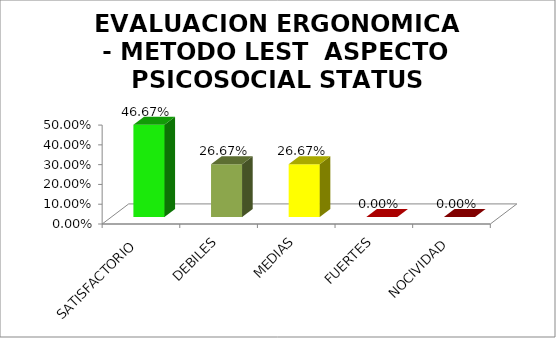
| Category | EVALUACION ERGONOMICA - METODO LEST  |
|---|---|
| SATISFACTORIO | 0.467 |
| DEBILES | 0.267 |
| MEDIAS | 0.267 |
| FUERTES | 0 |
| NOCIVIDAD | 0 |